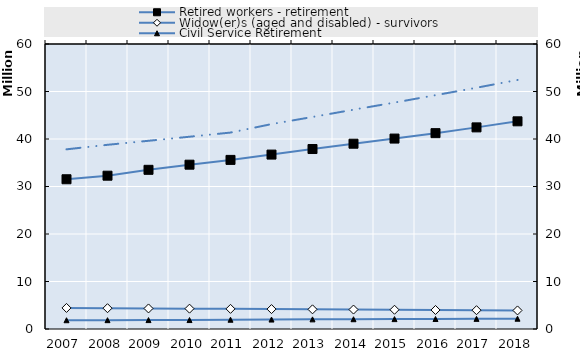
| Category | Retired workers - retirement  | Widow(er)s (aged and disabled) - survivors | Series 4 | Series 5 | Series 6 | Series 7 | Series 8 | Series 9 | Series 10 | Series 11 | Series 12 | Series 13 | Series 14 | Series 15 | Series 16 | Series 17 | Series 18 | Series 19 |
|---|---|---|---|---|---|---|---|---|---|---|---|---|---|---|---|---|---|---|
| 2007.0 | 31525098 | 4436338 |  |  |  |  |  |  |  |  |  |  |  |  |  |  |  |  |
| 2008.0 | 32273145 | 4380165 |  |  |  |  |  |  |  |  |  |  |  |  |  |  |  |  |
| 2009.0 | 33512193 | 4326976 |  |  |  |  |  |  |  |  |  |  |  |  |  |  |  |  |
| 2010.0 | 34592322 | 4285193 |  |  |  |  |  |  |  |  |  |  |  |  |  |  |  |  |
| 2011.0 | 35599046 | 4239077 |  |  |  |  |  |  |  |  |  |  |  |  |  |  |  |  |
| 2012.0 | 36719288 | 4193430 |  |  |  |  |  |  |  |  |  |  |  |  |  |  |  |  |
| 2013.0 | 37891025 | 4138923 |  |  |  |  |  |  |  |  |  |  |  |  |  |  |  |  |
| 2014.0 | 39008771 | 4092402 |  |  |  |  |  |  |  |  |  |  |  |  |  |  |  |  |
| 2015.0 | 40089061 | 4049705 |  |  |  |  |  |  |  |  |  |  |  |  |  |  |  |  |
| 2016.0 | 41233126 | 4004169 |  |  |  |  |  |  |  |  |  |  |  |  |  |  |  |  |
| 2017.0 | 42446992 | 3961114 |  |  |  |  |  |  |  |  |  |  |  |  |  |  |  |  |
| 2018.0 | 43721450 | 3907966 |  |  |  |  |  |  |  |  |  |  |  |  |  |  |  |  |